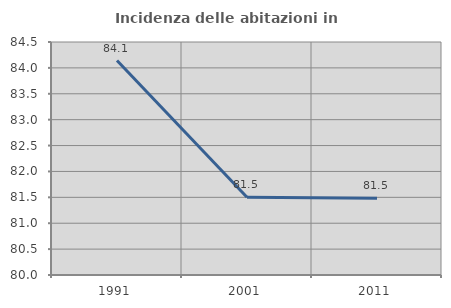
| Category | Incidenza delle abitazioni in proprietà  |
|---|---|
| 1991.0 | 84.141 |
| 2001.0 | 81.5 |
| 2011.0 | 81.481 |